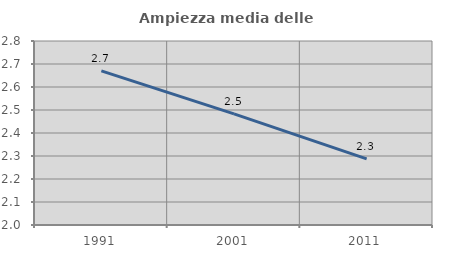
| Category | Ampiezza media delle famiglie |
|---|---|
| 1991.0 | 2.67 |
| 2001.0 | 2.483 |
| 2011.0 | 2.288 |